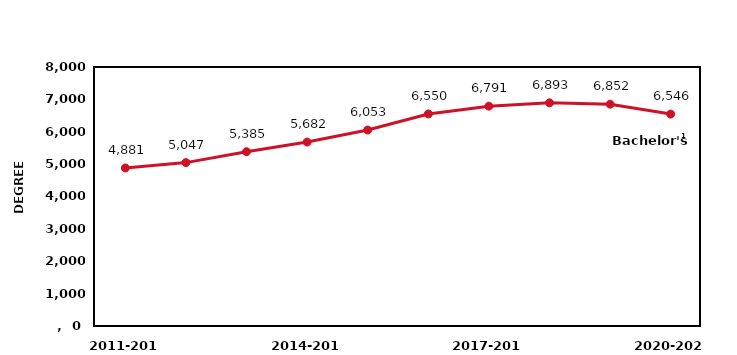
| Category | Series 0 |
|---|---|
| 2011-2012 | 4881 |
| 2012-2013 | 5047 |
| 2013-2014 | 5385 |
| 2014-2015 | 5682 |
| 2015-2016 | 6053 |
| 2016-2017 | 6550 |
| 2017-2018 | 6791 |
| 2018-2019 | 6893 |
| 2019-2020 | 6852 |
| 2020-2021 | 6546 |